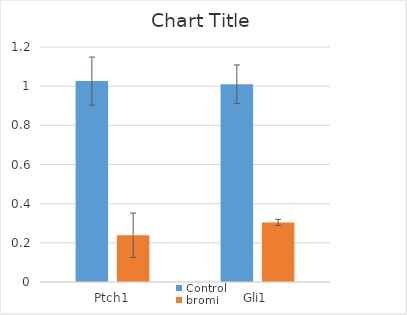
| Category | Control | bromi |
|---|---|---|
| Ptch1 | 1.026 | 0.239 |
| Gli1 | 1.01 | 0.304 |